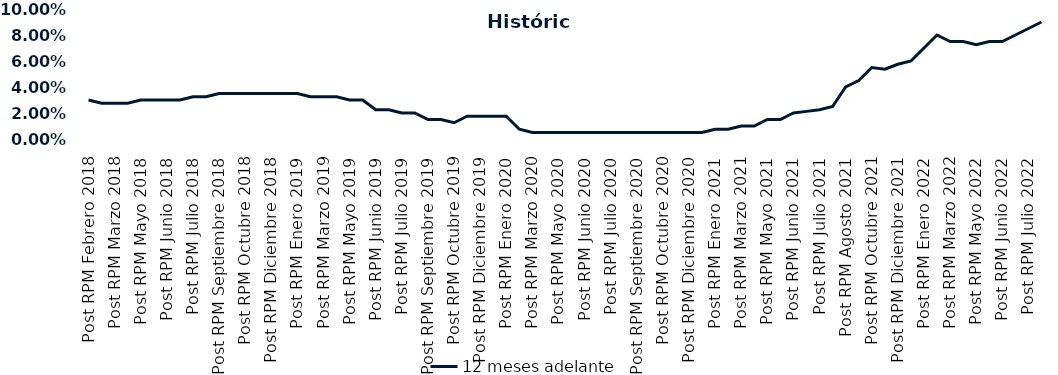
| Category | 12 meses adelante  |
|---|---|
| Post RPM Febrero 2018 | 0.03 |
| Pre RPM Marzo 2018 | 0.028 |
| Post RPM Marzo 2018 | 0.028 |
| Pre RPM Mayo 2018 | 0.028 |
| Post RPM Mayo 2018 | 0.03 |
| Pre RPM Junio 2018 | 0.03 |
| Post RPM Junio 2018 | 0.03 |
| Pre RPM Julio 2018 | 0.03 |
| Post RPM Julio 2018 | 0.032 |
| Pre RPM Septiembre 2018 | 0.032 |
| Post RPM Septiembre 2018 | 0.035 |
| Pre RPM Octubre 2018 | 0.035 |
| Post RPM Octubre 2018 | 0.035 |
| Pre RPM Diciembre 2018 | 0.035 |
| Post RPM Diciembre 2018 | 0.035 |
| Pre RPM Enero 2019 | 0.035 |
| Post RPM Enero 2019 | 0.035 |
| Pre RPM Marzo 2019 | 0.032 |
| Post RPM Marzo 2019 | 0.032 |
| Pre RPM Mayo 2019 | 0.032 |
| Post RPM Mayo 2019 | 0.03 |
| Pre RPM Junio 2019 | 0.03 |
| Post RPM Junio 2019 | 0.022 |
| Pre RPM Julio 2019 | 0.022 |
| Post RPM Julio 2019 | 0.02 |
| Pre RPM Septiembre 2019 | 0.02 |
| Post RPM Septiembre 2019 | 0.015 |
| Pre RPM Octubre 2019 | 0.015 |
| Post RPM Octubre 2019 | 0.012 |
| Pre RPM Diciembre 2019 | 0.018 |
| Post RPM Diciembre 2019 | 0.018 |
| Pre RPM Enero 2020 | 0.018 |
| Post RPM Enero 2020 | 0.018 |
| Pre RPM Marzo 2020 | 0.008 |
| Post RPM Marzo 2020 | 0.005 |
| Pre RPM Mayo 2020 | 0.005 |
| Post RPM Mayo 2020 | 0.005 |
| Pre RPM Junio 2020 | 0.005 |
| Post RPM Junio 2020 | 0.005 |
| Pre RPM Julio 2020 | 0.005 |
| Post RPM Julio 2020 | 0.005 |
| Pre RPM Septiembre 2020 | 0.005 |
| Post RPM Septiembre 2020 | 0.005 |
| Pre RPM Octubre 2020 | 0.005 |
| Post RPM Octubre 2020 | 0.005 |
| Pre RPM Diciembre 2020 | 0.005 |
| Post RPM Diciembre 2020 | 0.005 |
| Pre RPM Enero 2021 | 0.005 |
| Post RPM Enero 2021 | 0.008 |
| Pre RPM Marzo 2021 | 0.008 |
| Post RPM Marzo 2021 | 0.01 |
| Pre RPM Mayo 2021 | 0.01 |
| Post RPM Mayo 2021 | 0.015 |
| Pre RPM Junio 2021 | 0.015 |
| Post RPM Junio 2021 | 0.02 |
| Pre RPM Julio 2021 | 0.021 |
| Post RPM Julio 2021 | 0.022 |
| Pre RPM Agosto 2021 | 0.025 |
| Post RPM Agosto 2021 | 0.04 |
| Pre RPM Octubre 2021 | 0.045 |
| Post RPM Octubre 2021 | 0.055 |
| Pre RPM Diciembre 2021 | 0.054 |
| Post RPM Diciembre 2021 | 0.058 |
| Pre RPM Enero 2022 | 0.06 |
| Post RPM Enero 2022 | 0.07 |
| Pre RPM Marzo 2022 | 0.08 |
| Post RPM Marzo 2022 | 0.075 |
| Pre RPM Mayo 2022 | 0.075 |
| Post RPM Mayo 2022 | 0.072 |
| Pre RPM Junio 2022 | 0.075 |
| Post RPM Junio 2022 | 0.075 |
| Pre RPM Julio 2022 | 0.08 |
| Post RPM Julio 2022 | 0.085 |
| Pre RPM Septiembre 2022 | 0.09 |